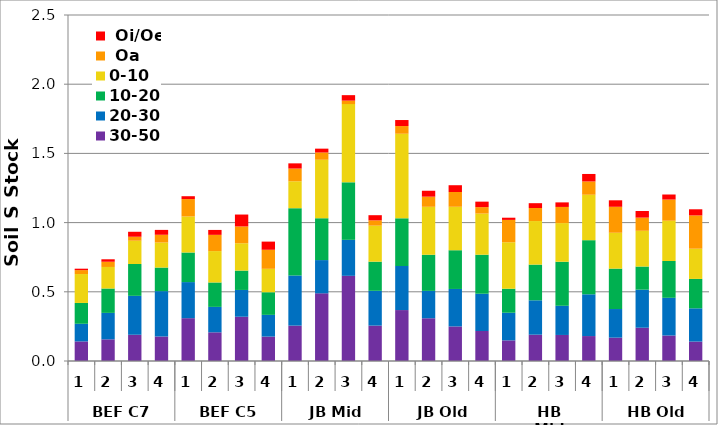
| Category | 30-50 | 20-30 | 10-20 | 0-10 |  Oa |  Oi/Oe |
|---|---|---|---|---|---|---|
| 0 | 0.142 | 0.127 | 0.151 | 0.209 | 0.028 | 0.01 |
| 1 | 0.157 | 0.191 | 0.176 | 0.156 | 0.038 | 0.018 |
| 2 | 0.19 | 0.281 | 0.23 | 0.168 | 0.029 | 0.036 |
| 3 | 0.177 | 0.328 | 0.17 | 0.181 | 0.056 | 0.035 |
| 4 | 0.309 | 0.261 | 0.214 | 0.26 | 0.126 | 0.021 |
| 5 | 0.207 | 0.184 | 0.176 | 0.227 | 0.117 | 0.036 |
| 6 | 0.32 | 0.194 | 0.14 | 0.197 | 0.122 | 0.086 |
| 7 | 0.176 | 0.157 | 0.163 | 0.169 | 0.138 | 0.059 |
| 8 | 0.256 | 0.362 | 0.486 | 0.194 | 0.092 | 0.038 |
| 9 | 0.489 | 0.24 | 0.302 | 0.423 | 0.053 | 0.028 |
| 10 | 0.615 | 0.26 | 0.416 | 0.565 | 0.025 | 0.039 |
| 11 | 0.256 | 0.251 | 0.211 | 0.26 | 0.038 | 0.037 |
| 12 | 0.368 | 0.318 | 0.345 | 0.611 | 0.056 | 0.043 |
| 13 | 0.309 | 0.198 | 0.261 | 0.347 | 0.073 | 0.043 |
| 14 | 0.25 | 0.271 | 0.28 | 0.314 | 0.107 | 0.049 |
| 15 | 0.217 | 0.269 | 0.282 | 0.297 | 0.047 | 0.04 |
| 16 | 0.149 | 0.2 | 0.173 | 0.336 | 0.162 | 0.016 |
| 17 | 0.19 | 0.248 | 0.258 | 0.315 | 0.094 | 0.035 |
| 18 | 0.188 | 0.211 | 0.318 | 0.279 | 0.117 | 0.033 |
| 19 | 0.18 | 0.302 | 0.391 | 0.328 | 0.096 | 0.054 |
| 20 | 0.169 | 0.207 | 0.292 | 0.259 | 0.188 | 0.047 |
| 21 | 0.24 | 0.275 | 0.167 | 0.258 | 0.095 | 0.048 |
| 22 | 0.184 | 0.272 | 0.266 | 0.291 | 0.153 | 0.036 |
| 23 | 0.14 | 0.24 | 0.213 | 0.218 | 0.24 | 0.044 |